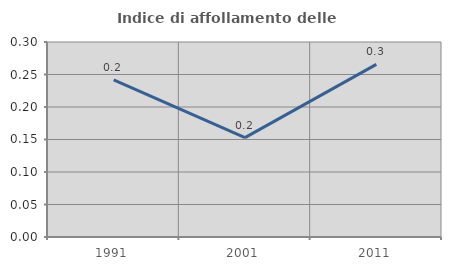
| Category | Indice di affollamento delle abitazioni  |
|---|---|
| 1991.0 | 0.242 |
| 2001.0 | 0.153 |
| 2011.0 | 0.265 |